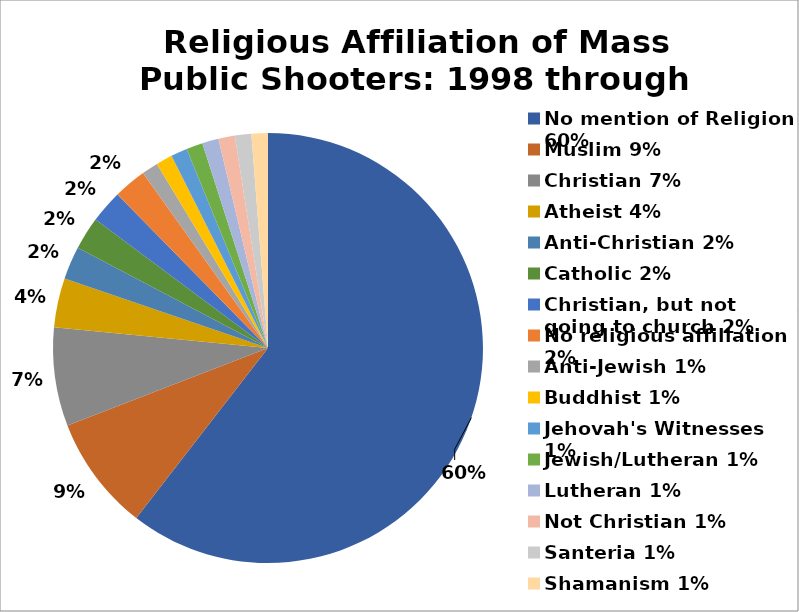
| Category | Series 1 |
|---|---|
| No mention of Religion 60% | 0.605 |
| Muslim 9% | 0.086 |
| Christian 7% | 0.074 |
| Atheist 4% | 0.037 |
| Anti-Christian 2% | 0.025 |
| Catholic 2% | 0.025 |
| Christian, but not going to church 2% | 0.025 |
| No religious affiliation 2% | 0.025 |
| Anti-Jewish 1% | 0.012 |
| Buddhist 1% | 0.012 |
| Jehovah's Witnesses 1% | 0.012 |
| Jewish/Lutheran 1% | 0.012 |
| Lutheran 1% | 0.012 |
| Not Christian 1% | 0.012 |
| Santeria 1% | 0.012 |
| Shamanism 1% | 0.012 |